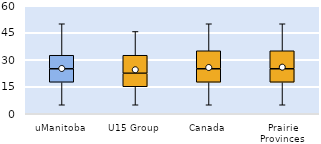
| Category | 25th | 50th | 75th |
|---|---|---|---|
| uManitoba | 17.5 | 7.5 | 7.5 |
| U15 Group | 15 | 7.5 | 10 |
| Canada | 17.5 | 7.5 | 10 |
| Prairie Provinces | 17.5 | 7.5 | 10 |